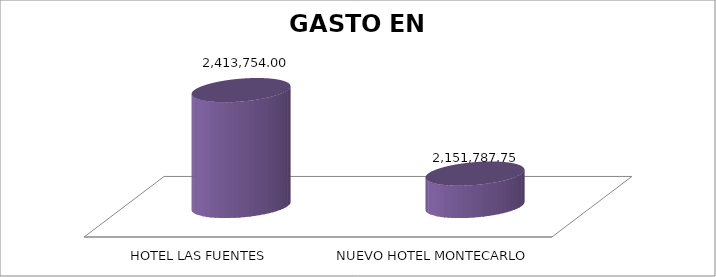
| Category | SUMA |
|---|---|
| HOTEL LAS FUENTES | 2413754 |
| NUEVO HOTEL MONTECARLO | 2151787.75 |